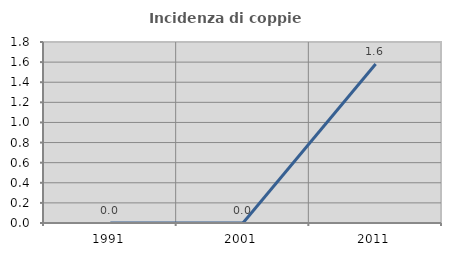
| Category | Incidenza di coppie miste |
|---|---|
| 1991.0 | 0 |
| 2001.0 | 0 |
| 2011.0 | 1.581 |